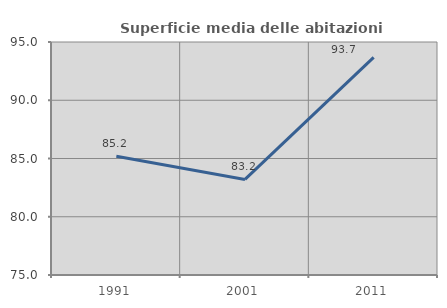
| Category | Superficie media delle abitazioni occupate |
|---|---|
| 1991.0 | 85.199 |
| 2001.0 | 83.205 |
| 2011.0 | 93.685 |